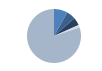
| Category | Series 0 |
|---|---|
| ARRASTRE | 94 |
| CERCO | 63 |
| PALANGRE | 54 |
| REDES DE ENMALLE | 18 |
| ARTES MENORES | 921 |
| SIN TIPO ASIGNADO | 1 |